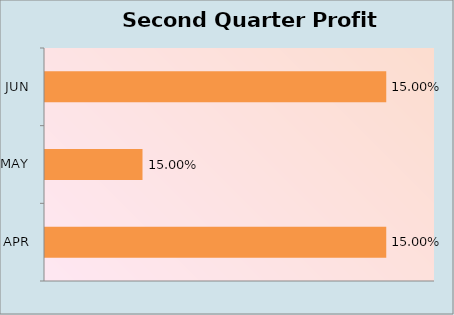
| Category | Series 0 |
|---|---|
| APR | 0.15 |
| MAY | 0.15 |
| JUN | 0.15 |